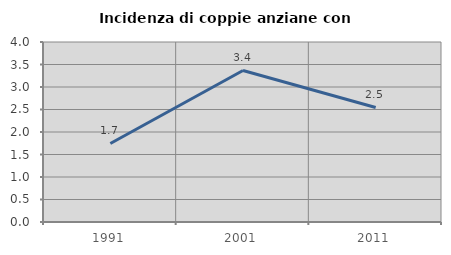
| Category | Incidenza di coppie anziane con figli |
|---|---|
| 1991.0 | 1.745 |
| 2001.0 | 3.367 |
| 2011.0 | 2.545 |